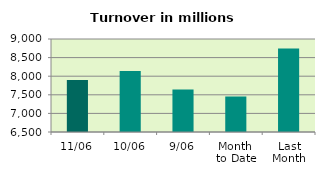
| Category | Series 0 |
|---|---|
| 11/06 | 7897.156 |
| 10/06 | 8143.045 |
| 9/06 | 7644.974 |
| Month 
to Date | 7454.511 |
| Last
Month | 8745.898 |